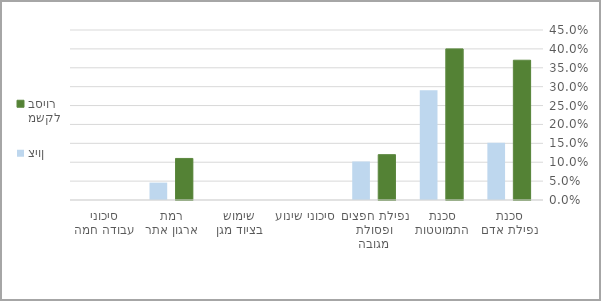
| Category | משקל בסיור | ציון |
|---|---|---|
| סכנת נפילת אדם | 0.37 | 0.152 |
| סכנת התמוטטות | 0.4 | 0.291 |
| נפילת חפצים ופסולת מגובה | 0.12 | 0.102 |
| סיכוני שינוע | 0 | 0 |
| שימוש בציוד מגן | 0 | 0 |
| רמת ארגון אתר | 0.11 | 0.046 |
| סיכוני עבודה חמה | 0 | 0 |